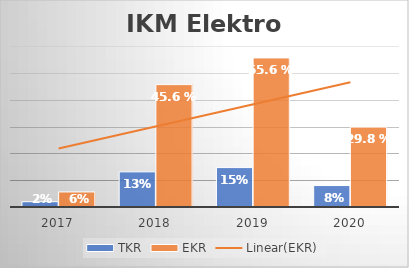
| Category | TKR | EKR |
|---|---|---|
| 2017.0 | 0.02 | 0.056 |
| 2018.0 | 0.131 | 0.456 |
| 2019.0 | 0.147 | 0.556 |
| 2020.0 | 0.08 | 0.298 |